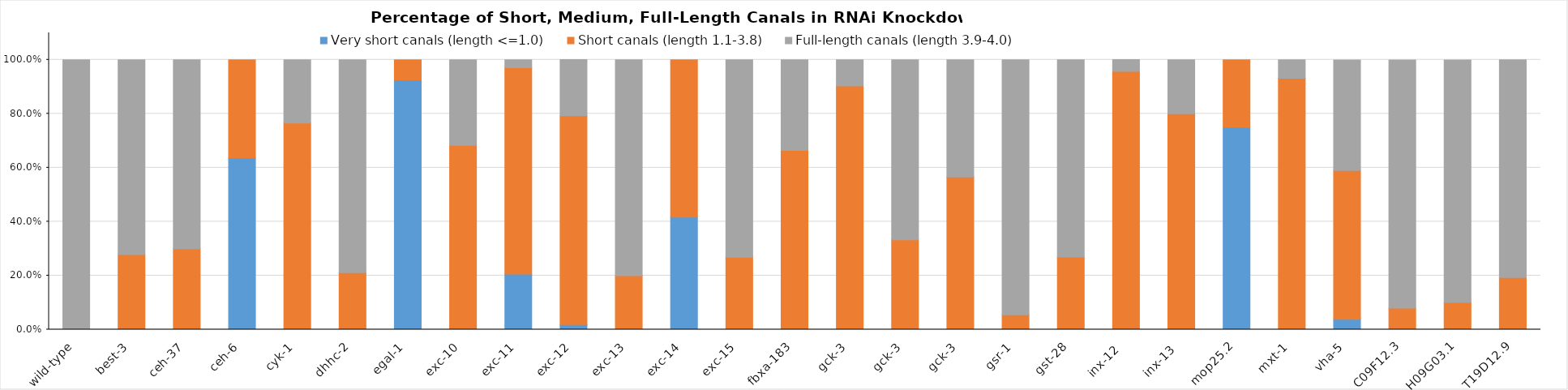
| Category | Very short canals (length <=1.0) | Short canals (length 1.1-3.8) | Full-length canals (length 3.9-4.0) |
|---|---|---|---|
| wild-type | 0 | 0 | 1 |
| best-3 | 0 | 0.278 | 0.722 |
| ceh-37 | 0 | 0.3 | 0.7 |
| ceh-6 | 0.636 | 0.364 | 0 |
| cyk-1 | 0 | 0.766 | 0.234 |
| dhhc-2 | 0 | 0.211 | 0.789 |
| egal-1 | 0.925 | 0.075 | 0 |
| exc-10 | 0 | 0.683 | 0.317 |
| exc-11 | 0.206 | 0.765 | 0.029 |
| exc-12 | 0.019 | 0.774 | 0.208 |
| exc-13 | 0 | 0.2 | 0.8 |
| exc-14 | 0.417 | 0.583 | 0 |
| exc-15 | 0 | 0.268 | 0.732 |
| fbxa-183 | 0 | 0.664 | 0.336 |
| gck-3 | 0 | 0.903 | 0.097 |
| gck-3 | 0 | 0.333 | 0.667 |
| gck-3 | 0 | 0.566 | 0.434 |
| gsr-1 | 0 | 0.055 | 0.945 |
| gst-28 | 0 | 0.269 | 0.731 |
| inx-12  | 0 | 0.957 | 0.043 |
| inx-13  | 0 | 0.8 | 0.2 |
| mop25.2 | 0.75 | 0.25 | 0 |
| mxt-1 | 0 | 0.932 | 0.068 |
| vha-5 | 0.038 | 0.551 | 0.41 |
| C09F12.3 | 0 | 0.08 | 0.92 |
| H09G03.1 | 0 | 0.101 | 0.899 |
| T19D12.9 | 0 | 0.193 | 0.807 |